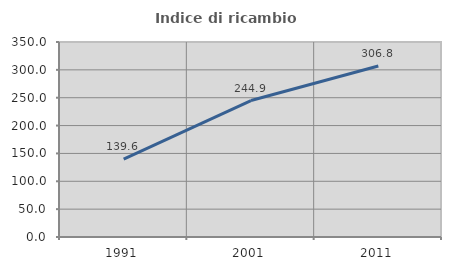
| Category | Indice di ricambio occupazionale  |
|---|---|
| 1991.0 | 139.604 |
| 2001.0 | 244.872 |
| 2011.0 | 306.796 |